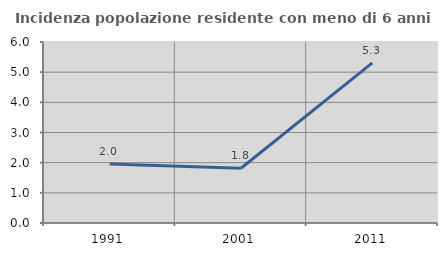
| Category | Incidenza popolazione residente con meno di 6 anni |
|---|---|
| 1991.0 | 1.957 |
| 2001.0 | 1.814 |
| 2011.0 | 5.31 |